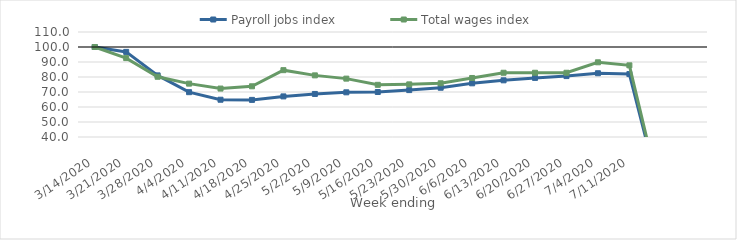
| Category | Payroll jobs index | Total wages index |
|---|---|---|
| 14/03/2020 | 100 | 100 |
| 21/03/2020 | 96.736 | 92.598 |
| 28/03/2020 | 81.068 | 80.155 |
| 04/04/2020 | 69.878 | 75.58 |
| 11/04/2020 | 64.852 | 72.285 |
| 18/04/2020 | 64.742 | 73.806 |
| 25/04/2020 | 67.065 | 84.555 |
| 02/05/2020 | 68.705 | 81.088 |
| 09/05/2020 | 69.788 | 78.912 |
| 16/05/2020 | 69.992 | 74.784 |
| 23/05/2020 | 71.269 | 75.085 |
| 30/05/2020 | 72.846 | 75.805 |
| 06/06/2020 | 75.783 | 79.345 |
| 13/06/2020 | 77.782 | 82.829 |
| 20/06/2020 | 79.405 | 82.829 |
| 27/06/2020 | 80.614 | 82.829 |
| 04/07/2020 | 82.506 | 89.793 |
| 11/07/2020 | 81.947 | 87.78 |